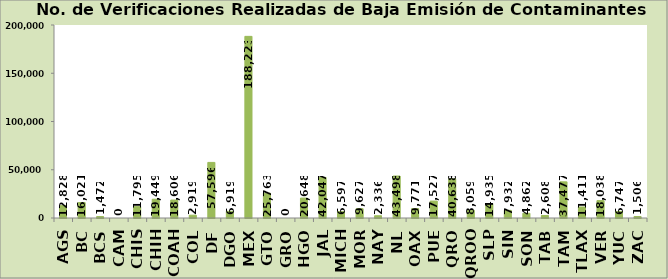
| Category | No. de Verificaciones Realizadas |
|---|---|
| AGS | 12828 |
| BC | 16021 |
| BCS | 1472 |
| CAM | 0 |
| CHIS | 11795 |
| CHIH | 19449 |
| COAH | 18606 |
| COL | 2919 |
| DF | 57596 |
| DGO | 6919 |
| MEX | 188223 |
| GTO | 25763 |
| GRO | 0 |
| HGO | 20648 |
| JAL | 42047 |
| MICH | 6597 |
| MOR | 9627 |
| NAY | 2336 |
| NL | 43498 |
| OAX | 9771 |
| PUE | 17527 |
| QRO | 40638 |
| QROO | 8059 |
| SLP | 14935 |
| SIN | 7932 |
| SON | 4862 |
| TAB | 2608 |
| TAM | 37477 |
| TLAX | 11411 |
| VER | 18038 |
| YUC | 6747 |
| ZAC | 1506 |